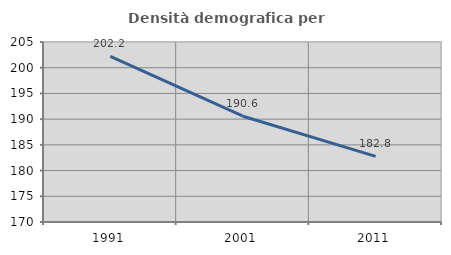
| Category | Densità demografica |
|---|---|
| 1991.0 | 202.224 |
| 2001.0 | 190.571 |
| 2011.0 | 182.765 |